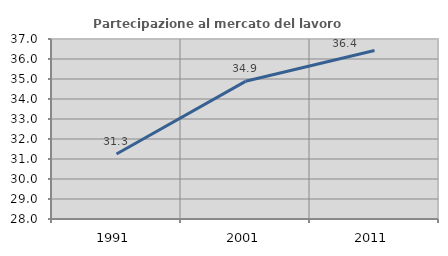
| Category | Partecipazione al mercato del lavoro  femminile |
|---|---|
| 1991.0 | 31.25 |
| 2001.0 | 34.884 |
| 2011.0 | 36.424 |